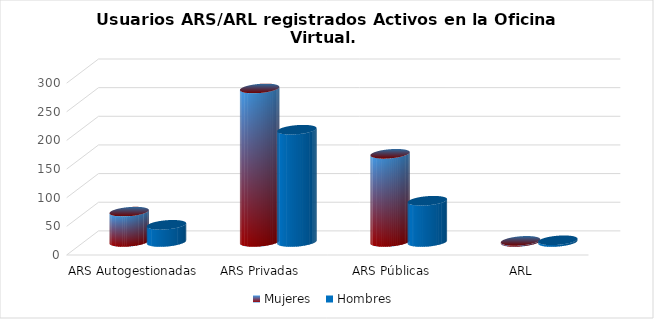
| Category | Mujeres | Hombres |
|---|---|---|
| ARS Autogestionadas | 53 | 30 |
| ARS Privadas | 268 | 196 |
| ARS Públicas | 154 | 72 |
| ARL | 2 | 3 |